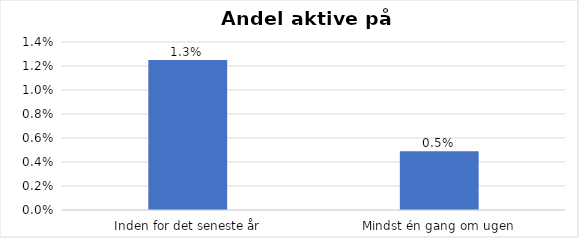
| Category | % |
|---|---|
| Inden for det seneste år | 0.013 |
| Mindst én gang om ugen | 0.005 |